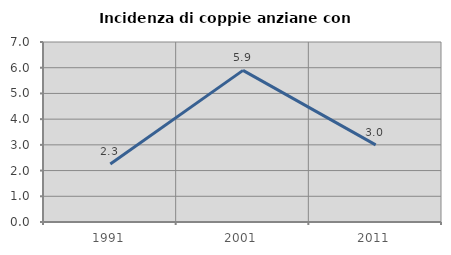
| Category | Incidenza di coppie anziane con figli |
|---|---|
| 1991.0 | 2.257 |
| 2001.0 | 5.896 |
| 2011.0 | 3 |